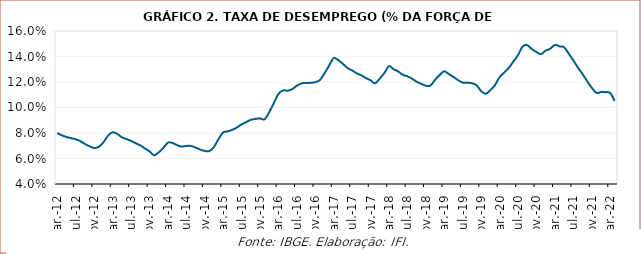
| Category | Taxa de desemprego |
|---|---|
| 2012-03-01 | 0.08 |
| 2012-04-01 | 0.078 |
| 2012-05-01 | 0.077 |
| 2012-06-01 | 0.076 |
| 2012-07-01 | 0.075 |
| 2012-08-01 | 0.074 |
| 2012-09-01 | 0.071 |
| 2012-10-01 | 0.07 |
| 2012-11-01 | 0.068 |
| 2012-12-01 | 0.069 |
| 2013-01-01 | 0.073 |
| 2013-02-01 | 0.078 |
| 2013-03-01 | 0.081 |
| 2013-04-01 | 0.079 |
| 2013-05-01 | 0.077 |
| 2013-06-01 | 0.075 |
| 2013-07-01 | 0.074 |
| 2013-08-01 | 0.072 |
| 2013-09-01 | 0.07 |
| 2013-10-01 | 0.068 |
| 2013-11-01 | 0.066 |
| 2013-12-01 | 0.063 |
| 2014-01-01 | 0.065 |
| 2014-02-01 | 0.068 |
| 2014-03-01 | 0.072 |
| 2014-04-01 | 0.072 |
| 2014-05-01 | 0.071 |
| 2014-06-01 | 0.069 |
| 2014-07-01 | 0.07 |
| 2014-08-01 | 0.07 |
| 2014-09-01 | 0.069 |
| 2014-10-01 | 0.067 |
| 2014-11-01 | 0.066 |
| 2014-12-01 | 0.066 |
| 2015-01-01 | 0.069 |
| 2015-02-01 | 0.075 |
| 2015-03-01 | 0.08 |
| 2015-04-01 | 0.081 |
| 2015-05-01 | 0.083 |
| 2015-06-01 | 0.084 |
| 2015-07-01 | 0.087 |
| 2015-08-01 | 0.089 |
| 2015-09-01 | 0.09 |
| 2015-10-01 | 0.091 |
| 2015-11-01 | 0.091 |
| 2015-12-01 | 0.091 |
| 2016-01-01 | 0.096 |
| 2016-02-01 | 0.103 |
| 2016-03-01 | 0.111 |
| 2016-04-01 | 0.113 |
| 2016-05-01 | 0.113 |
| 2016-06-01 | 0.114 |
| 2016-07-01 | 0.117 |
| 2016-08-01 | 0.119 |
| 2016-09-01 | 0.119 |
| 2016-10-01 | 0.119 |
| 2016-11-01 | 0.12 |
| 2016-12-01 | 0.122 |
| 2017-01-01 | 0.127 |
| 2017-02-01 | 0.133 |
| 2017-03-01 | 0.139 |
| 2017-04-01 | 0.137 |
| 2017-05-01 | 0.134 |
| 2017-06-01 | 0.131 |
| 2017-07-01 | 0.129 |
| 2017-08-01 | 0.127 |
| 2017-09-01 | 0.125 |
| 2017-10-01 | 0.123 |
| 2017-11-01 | 0.121 |
| 2017-12-01 | 0.119 |
| 2018-01-01 | 0.123 |
| 2018-02-01 | 0.127 |
| 2018-03-01 | 0.132 |
| 2018-04-01 | 0.13 |
| 2018-05-01 | 0.128 |
| 2018-06-01 | 0.126 |
| 2018-07-01 | 0.124 |
| 2018-08-01 | 0.123 |
| 2018-09-01 | 0.12 |
| 2018-10-01 | 0.119 |
| 2018-11-01 | 0.117 |
| 2018-12-01 | 0.117 |
| 2019-01-01 | 0.122 |
| 2019-02-01 | 0.126 |
| 2019-03-01 | 0.128 |
| 2019-04-01 | 0.126 |
| 2019-05-01 | 0.124 |
| 2019-06-01 | 0.121 |
| 2019-07-01 | 0.12 |
| 2019-08-01 | 0.119 |
| 2019-09-01 | 0.119 |
| 2019-10-01 | 0.118 |
| 2019-11-01 | 0.113 |
| 2019-12-01 | 0.111 |
| 2020-01-01 | 0.114 |
| 2020-02-01 | 0.118 |
| 2020-03-01 | 0.124 |
| 2020-04-01 | 0.127 |
| 2020-05-01 | 0.131 |
| 2020-06-01 | 0.136 |
| 2020-07-01 | 0.141 |
| 2020-08-01 | 0.148 |
| 2020-09-01 | 0.149 |
| 2020-10-01 | 0.146 |
| 2020-11-01 | 0.144 |
| 2020-12-01 | 0.142 |
| 2021-01-01 | 0.145 |
| 2021-02-01 | 0.146 |
| 2021-03-01 | 0.149 |
| 2021-04-01 | 0.148 |
| 2021-05-01 | 0.147 |
| 2021-06-01 | 0.142 |
| 2021-07-01 | 0.137 |
| 2021-08-01 | 0.131 |
| 2021-09-01 | 0.126 |
| 2021-10-01 | 0.121 |
| 2021-11-01 | 0.116 |
| 2021-12-01 | 0.111 |
| 2022-01-01 | 0.112 |
| 2022-02-01 | 0.112 |
| 2022-03-01 | 0.111 |
| 2022-04-01 | 0.105 |